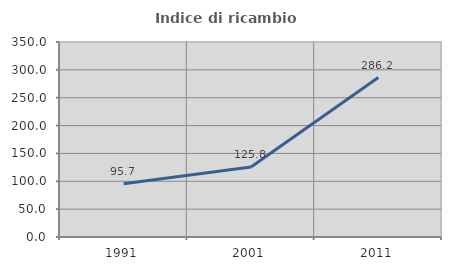
| Category | Indice di ricambio occupazionale  |
|---|---|
| 1991.0 | 95.745 |
| 2001.0 | 125.758 |
| 2011.0 | 286.239 |